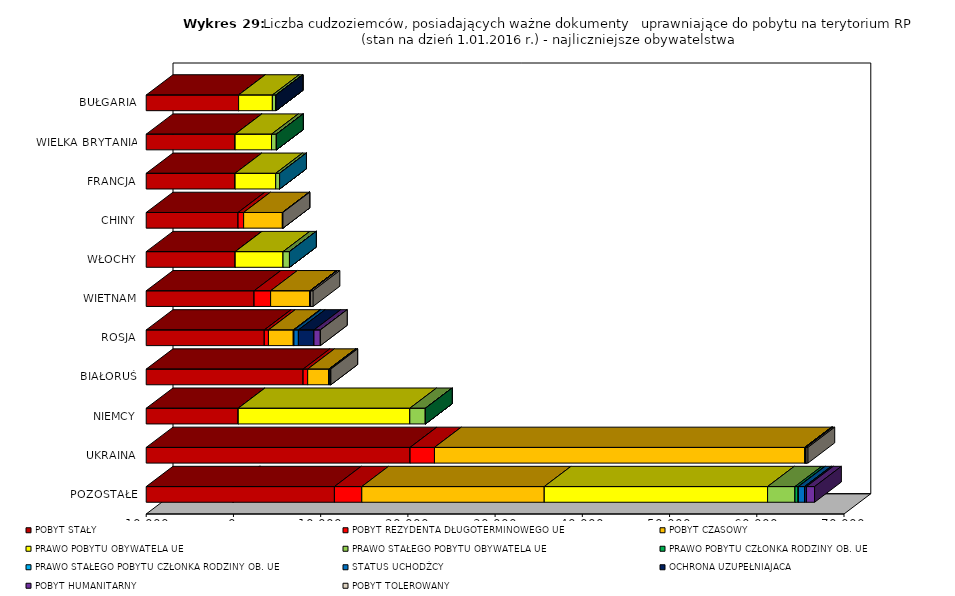
| Category | POBYT STAŁY | POBYT REZYDENTA DŁUGOTERMINOWEGO UE | POBYT CZASOWY | PRAWO POBYTU OBYWATELA UE | PRAWO STAŁEGO POBYTU OBYWATELA UE | PRAWO POBYTU CZŁONKA RODZINY OB. UE | PRAWO STAŁEGO POBYTU CZŁONKA RODZINY OB. UE | STATUS UCHODŹCY | OCHRONA UZUPEŁNIAJACA | POBYT HUMANITARNY | POBYT TOLEROWANY |
|---|---|---|---|---|---|---|---|---|---|---|---|
| POZOSTAŁE | 11579 | 3138 | 20919 | 25603 | 3143 | 362 | 29 | 700 | 233 | 921 | -119 |
| UKRAINA | 20252 | 2796 | 42451 | 0 | 0 | 102 | 23 | 2 | 35 | 3 | 202 |
| NIEMCY | 551 | 0 | 0 | 19670 | 1789 | 0 | 0 | 0 | 0 | 0 | 0 |
| BIAŁORUŚ | 7991 | 523 | 2439 | 0 | 0 | 25 | 17 | 135 | 0 | 39 | 2 |
| ROSJA | 3539 | 476 | 2850 | 0 | 0 | 60 | 15 | 509 | 1785 | 735 | 3 |
| WIETNAM | 2368 | 1894 | 4517 | 0 | 0 | 6 | 0 | 4 | 2 | 97 | 242 |
| WŁOCHY | 204 | 0 | 0 | 5484 | 738 | 0 | 0 | 0 | 0 | 0 | 0 |
| CHINY | 533 | 637 | 4447 | 0 | 0 | 41 | 0 | 9 | 1 | 3 | 4 |
| FRANCJA | 190 | 0 | 0 | 4656 | 451 | 0 | 0 | 0 | 0 | 0 | 0 |
| WIELKA BRYTANIA | 193 | 0 | 0 | 4174 | 562 | 0 | 0 | 0 | 0 | 0 | 0 |
| BUŁGARIA | 589 | 5 | 0 | 3873 | 415 | 0 | 0 | 0 | 2 | 0 | 0 |